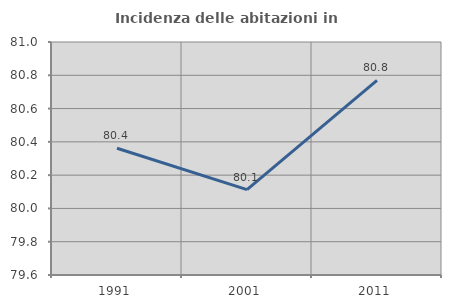
| Category | Incidenza delle abitazioni in proprietà  |
|---|---|
| 1991.0 | 80.361 |
| 2001.0 | 80.113 |
| 2011.0 | 80.769 |